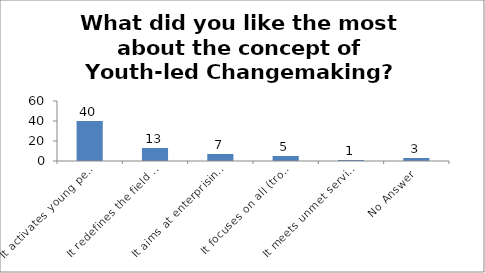
| Category | What did you like the most about the concept of Youth-led Changemaking? |
|---|---|
| It activates young people as changemakers | 40 |
| It redefines the field of youth development | 13 |
| It aims at enterprising education | 7 |
| It focuses on all (troubled and prepared) young people | 5 |
| It meets unmet service needs of the society | 1 |
| No Answer | 3 |